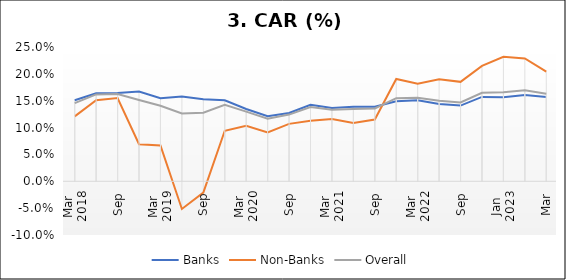
| Category | Banks | Non-Banks | Overall |
|---|---|---|---|
| 0 | 0.151 | 0.121 | 0.145 |
| 1 | 0.164 | 0.151 | 0.162 |
| 2 | 0.164 | 0.155 | 0.163 |
| 3 | 0.167 | 0.069 | 0.151 |
| 4 | 0.155 | 0.067 | 0.141 |
| 5 | 0.158 | -0.051 | 0.126 |
| 6 | 0.153 | -0.021 | 0.128 |
| 7 | 0.151 | 0.094 | 0.142 |
| 8 | 0.135 | 0.103 | 0.13 |
| 9 | 0.121 | 0.091 | 0.116 |
| 10 | 0.127 | 0.107 | 0.124 |
| 11 | 0.142 | 0.113 | 0.138 |
| 12 | 0.136 | 0.116 | 0.133 |
| 13 | 0.139 | 0.109 | 0.134 |
| 14 | 0.139 | 0.115 | 0.136 |
| 15 | 0.149 | 0.191 | 0.155 |
| 16 | 0.151 | 0.182 | 0.156 |
| 17 | 0.144 | 0.19 | 0.15 |
| 18 | 0.141 | 0.185 | 0.147 |
| 19 | 0.157 | 0.215 | 0.165 |
| 20 | 0.156 | 0.232 | 0.166 |
| 21 | 0.161 | 0.229 | 0.169 |
| 22 | 0.157 | 0.204 | 0.163 |